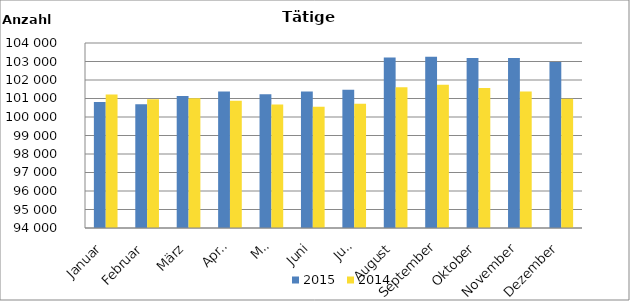
| Category | 2015 | 2014 |
|---|---|---|
| Januar | 100817 | 101219 |
| Februar | 100690 | 100961 |
| März | 101130 | 101013 |
| April | 101381 | 100880 |
| Mai | 101236 | 100673 |
| Juni | 101373 | 100548 |
| Juli | 101470 | 100722 |
| August | 103211 | 101612 |
| September | 103256 | 101748 |
| Oktober | 103189 | 101569 |
| November | 103184 | 101384 |
| Dezember | 102973 | 100982 |